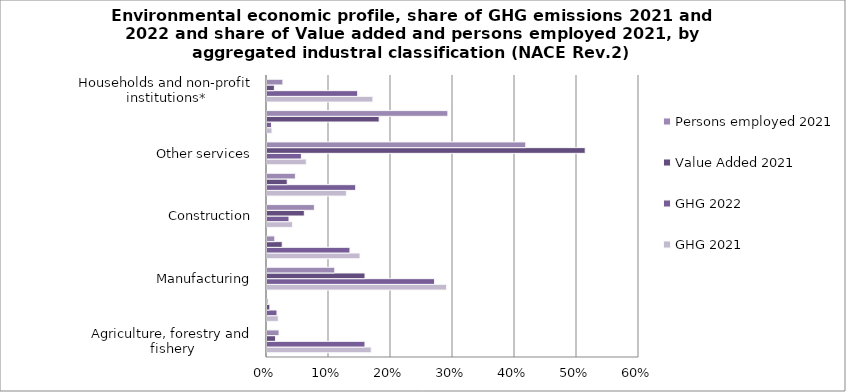
| Category | GHG 2021 | GHG 2022 | Value Added 2021 | Persons employed 2021 |
|---|---|---|---|---|
| Agriculture, forestry and fishery | 0.168 | 0.158 | 0.014 | 0.019 |
| Mining | 0.018 | 0.016 | 0.005 | 0.002 |
| Manufacturing | 0.29 | 0.27 | 0.158 | 0.109 |
| Electricity, gas and hot water supply, water distribution, 
waste water and waste management | 0.15 | 0.134 | 0.025 | 0.013 |
| Construction | 0.041 | 0.035 | 0.06 | 0.076 |
| Transport | 0.128 | 0.143 | 0.033 | 0.046 |
| Other services | 0.063 | 0.055 | 0.513 | 0.417 |
| Public sector | 0.008 | 0.007 | 0.181 | 0.292 |
| Households and non-profit institutions* | 0.171 | 0.146 | 0.012 | 0.026 |